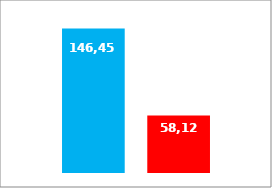
| Category | Dem | Rep |
|---|---|---|
| 0 | 146452.607 | 58120.37 |